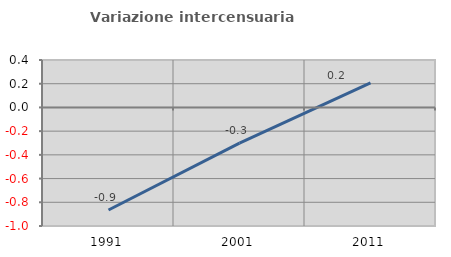
| Category | Variazione intercensuaria annua |
|---|---|
| 1991.0 | -0.865 |
| 2001.0 | -0.301 |
| 2011.0 | 0.208 |